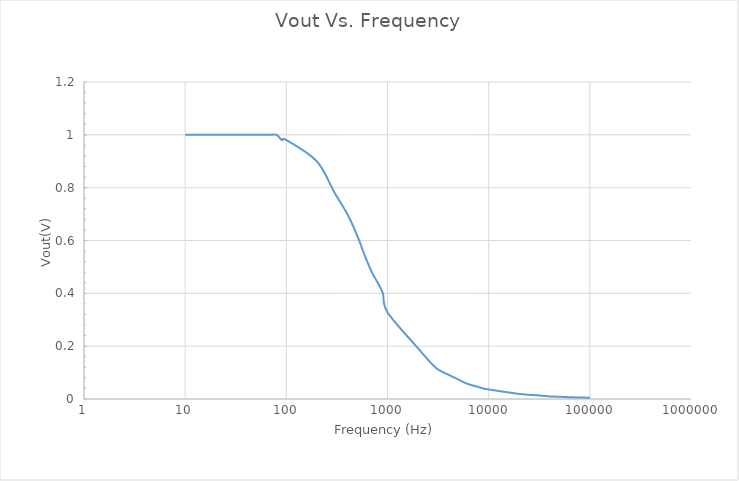
| Category | Series 0 |
|---|---|
| 10.0 | 1 |
| 20.0 | 1 |
| 30.01 | 1 |
| 40.0 | 1 |
| 50.06 | 1 |
| 60.02 | 1 |
| 70.03 | 1 |
| 80.26 | 1 |
| 90.25 | 0.98 |
| 100.3 | 0.98 |
| 200.0 | 0.9 |
| 300.6 | 0.78 |
| 400.6 | 0.7 |
| 500.1 | 0.62 |
| 600.2 | 0.54 |
| 700.3 | 0.48 |
| 800.6 | 0.44 |
| 900.1 | 0.4 |
| 1001.0 | 0.328 |
| 2003.0 | 0.192 |
| 3006.0 | 0.118 |
| 4003.0 | 0.092 |
| 5005.0 | 0.074 |
| 6002.0 | 0.059 |
| 7003.0 | 0.051 |
| 8006.0 | 0.045 |
| 9001.0 | 0.039 |
| 10060.0 | 0.036 |
| 20040.0 | 0.019 |
| 30030.0 | 0.014 |
| 40160.0 | 0.01 |
| 50300.0 | 0.008 |
| 60100.0 | 0.007 |
| 70030.0 | 0.006 |
| 80060.0 | 0.006 |
| 90090.0 | 0.005 |
| 100200.0 | 0.005 |